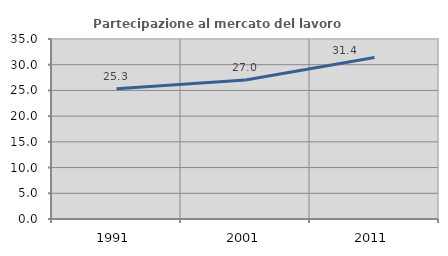
| Category | Partecipazione al mercato del lavoro  femminile |
|---|---|
| 1991.0 | 25.317 |
| 2001.0 | 27.025 |
| 2011.0 | 31.415 |